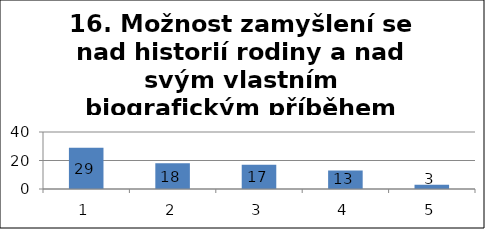
| Category | Series 1 |
|---|---|
| 0 | 29 |
| 1 | 18 |
| 2 | 17 |
| 3 | 13 |
| 4 | 3 |